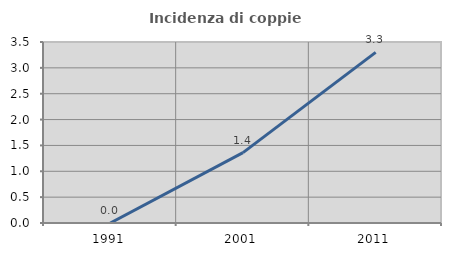
| Category | Incidenza di coppie miste |
|---|---|
| 1991.0 | 0 |
| 2001.0 | 1.361 |
| 2011.0 | 3.3 |